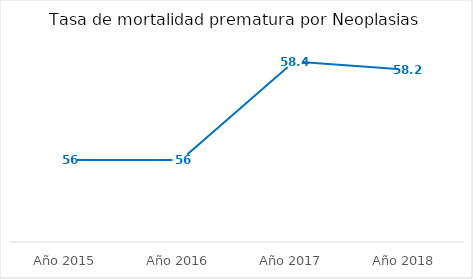
| Category | Tasa de mortalidad prematura por Neoplasias |
|---|---|
| Año 2015 | 56 |
| Año 2016 | 56 |
| Año 2017 | 58.4 |
| Año 2018 | 58.2 |